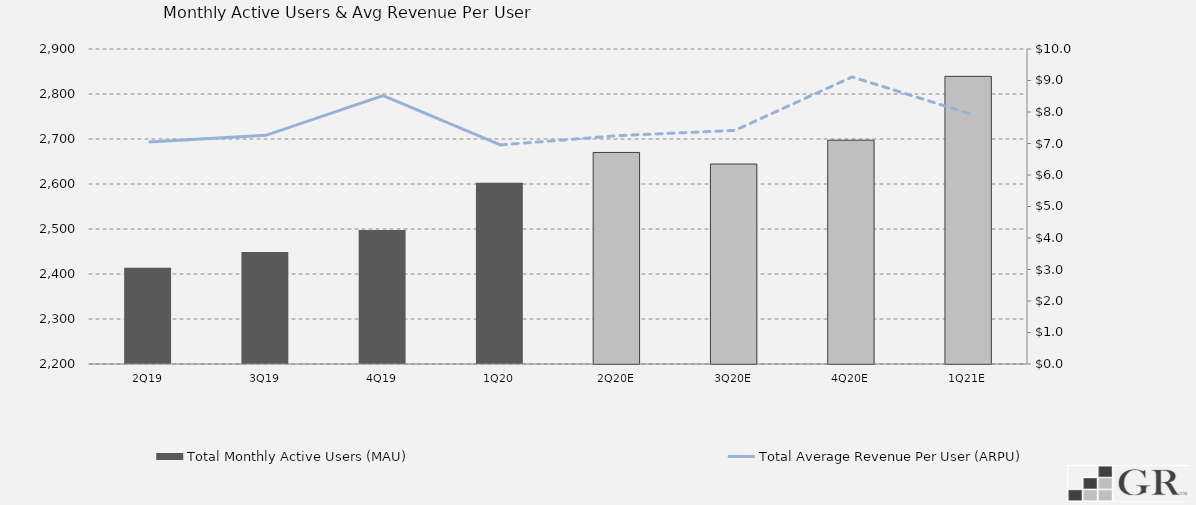
| Category | Total Monthly Active Users (MAU)  |
|---|---|
|  2Q19  | 2414 |
|  3Q19  | 2449 |
|  4Q19  | 2497.8 |
|  1Q20  | 2603 |
|  2Q20E  | 2670.072 |
|  3Q20E  | 2644.422 |
|  4Q20E  | 2697.396 |
|  1Q21E  | 2839.239 |